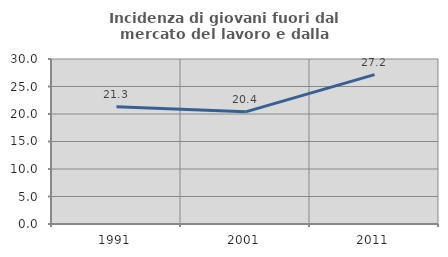
| Category | Incidenza di giovani fuori dal mercato del lavoro e dalla formazione  |
|---|---|
| 1991.0 | 21.302 |
| 2001.0 | 20.395 |
| 2011.0 | 27.16 |